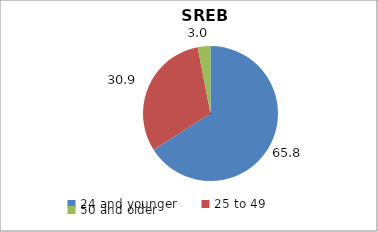
| Category | Series 0 | Series 1 |
|---|---|---|
| 24 and younger | 65.821 | 65.821 |
| 25 to 49 | 30.932 | 30.932 |
| 50 and older | 3.042 | 3.042 |